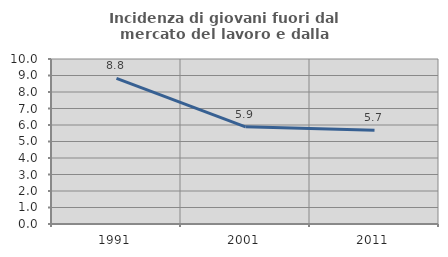
| Category | Incidenza di giovani fuori dal mercato del lavoro e dalla formazione  |
|---|---|
| 1991.0 | 8.828 |
| 2001.0 | 5.887 |
| 2011.0 | 5.682 |